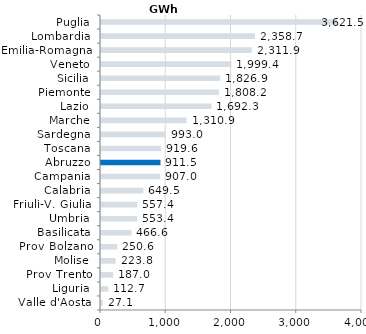
| Category | Series 0 |
|---|---|
| Valle d'Aosta | 27.1 |
| Liguria | 112.7 |
| Prov Trento | 187 |
| Molise | 223.8 |
| Prov Bolzano | 250.6 |
| Basilicata | 466.6 |
| Umbria | 553.4 |
| Friuli-V. Giulia | 557.4 |
| Calabria | 649.5 |
| Campania | 907 |
| Abruzzo | 911.5 |
| Toscana | 919.6 |
| Sardegna | 993 |
| Marche | 1310.9 |
| Lazio | 1692.3 |
| Piemonte | 1808.2 |
| Sicilia | 1826.9 |
| Veneto | 1999.4 |
| Emilia-Romagna | 2311.9 |
| Lombardia | 2358.7 |
| Puglia | 3621.5 |